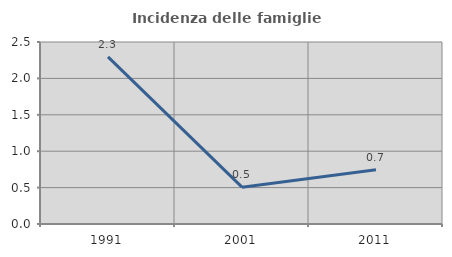
| Category | Incidenza delle famiglie numerose |
|---|---|
| 1991.0 | 2.296 |
| 2001.0 | 0.506 |
| 2011.0 | 0.746 |